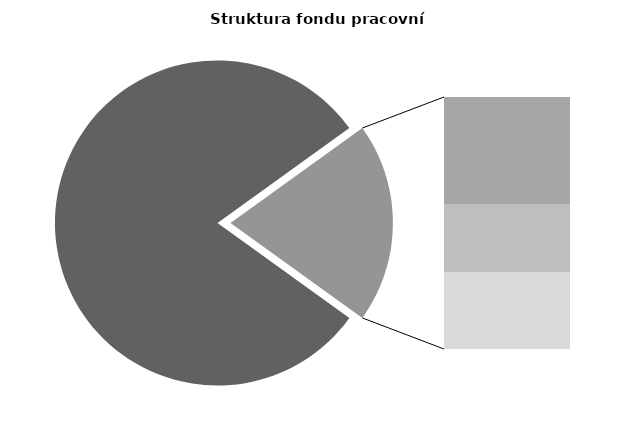
| Category | Series 0 |
|---|---|
| Průměrná měsíční odpracovaná doba bez přesčasu | 135.65 |
| Dovolená | 14.365 |
| Nemoc | 9 |
| Jiné | 10.26 |